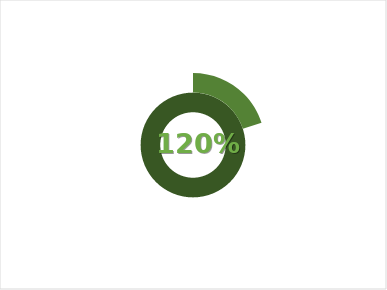
| Category | Series 0 | Series 1 | Series 2 | Series 3 | Series 4 |
|---|---|---|---|---|---|
| 0 | 1 | 0.2 | 0 | 0 | 0 |
| 1 | 0 | 0.8 | 1 | 1 | 1 |